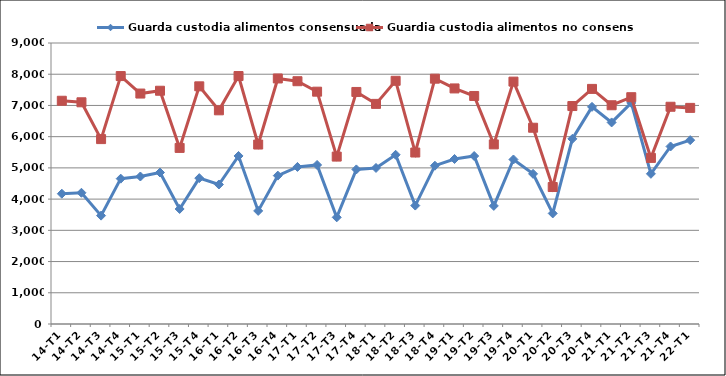
| Category | Guarda custodia alimentos consensuada | Guardia custodia alimentos no consensuada |
|---|---|---|
| 14-T1 | 4173 | 7150 |
| 14-T2 | 4203 | 7101 |
| 14-T3 | 3471 | 5922 |
| 14-T4 | 4655 | 7941 |
| 15-T1 | 4724 | 7381 |
| 15-T2 | 4852 | 7471 |
| 15-T3 | 3684 | 5640 |
| 15-T4 | 4672 | 7612 |
| 16-T1 | 4468 | 6844 |
| 16-T2 | 5382 | 7942 |
| 16-T3 | 3622 | 5748 |
| 16-T4 | 4753 | 7864 |
| 17-T1 | 5030 | 7776 |
| 17-T2 | 5094 | 7441 |
| 17-T3 | 3417 | 5362 |
| 17-T4 | 4951 | 7432 |
| 18-T1 | 4998 | 7050 |
| 18-T2 | 5420 | 7789 |
| 18-T3 | 3793 | 5492 |
| 18-T4 | 5070 | 7857 |
| 19-T1 | 5285 | 7545 |
| 19-T2 | 5380 | 7303 |
| 19-T3 | 3782 | 5753 |
| 19-T4 | 5269 | 7763 |
| 20-T1 | 4809 | 6286 |
| 20-T2 | 3542 | 4387 |
| 20-T3 | 5930 | 6981 |
| 20-T4 | 6955 | 7530 |
| 21-T1 | 6456 | 7006 |
| 21-T2 | 7080 | 7264 |
| 21-T3 | 4810 | 5320 |
| 21-T4 | 5686 | 6958 |
| 22-T1 | 5888 | 6922 |